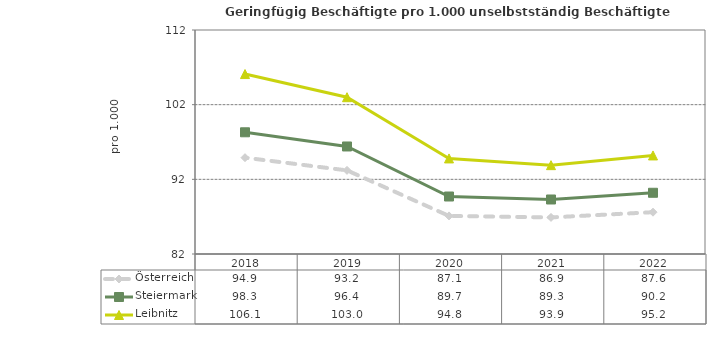
| Category | Österreich | Steiermark | Leibnitz |
|---|---|---|---|
| 2022.0 | 87.6 | 90.2 | 95.2 |
| 2021.0 | 86.9 | 89.3 | 93.9 |
| 2020.0 | 87.1 | 89.7 | 94.8 |
| 2019.0 | 93.2 | 96.4 | 103 |
| 2018.0 | 94.9 | 98.3 | 106.1 |